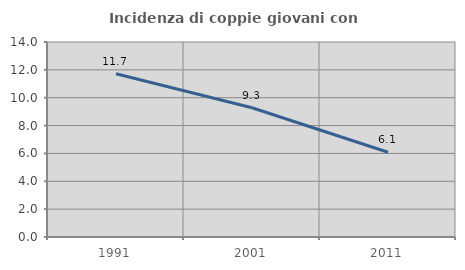
| Category | Incidenza di coppie giovani con figli |
|---|---|
| 1991.0 | 11.715 |
| 2001.0 | 9.278 |
| 2011.0 | 6.087 |